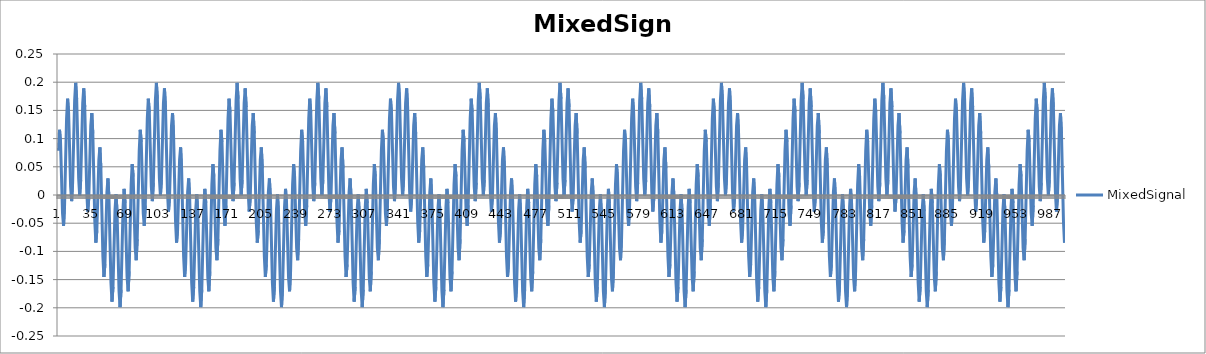
| Category | MixedSignal |
|---|---|
| 0 | 0.079 |
| 1 | 0.116 |
| 2 | 0.094 |
| 3 | 0.031 |
| 4 | -0.032 |
| 5 | -0.055 |
| 6 | -0.018 |
| 7 | 0.059 |
| 8 | 0.136 |
| 9 | 0.171 |
| 10 | 0.147 |
| 11 | 0.081 |
| 12 | 0.015 |
| 13 | -0.011 |
| 14 | 0.022 |
| 15 | 0.095 |
| 16 | 0.168 |
| 17 | 0.199 |
| 18 | 0.17 |
| 19 | 0.1 |
| 20 | 0.029 |
| 21 | -0.001 |
| 22 | 0.027 |
| 23 | 0.095 |
| 24 | 0.163 |
| 25 | 0.189 |
| 26 | 0.156 |
| 27 | 0.081 |
| 28 | 0.005 |
| 29 | -0.029 |
| 30 | -0.006 |
| 31 | 0.059 |
| 32 | 0.123 |
| 33 | 0.145 |
| 34 | 0.109 |
| 35 | 0.031 |
| 36 | -0.047 |
| 37 | -0.084 |
| 38 | -0.063 |
| 39 | 0 |
| 40 | 0.063 |
| 41 | 0.084 |
| 42 | 0.047 |
| 43 | -0.031 |
| 44 | -0.109 |
| 45 | -0.145 |
| 46 | -0.123 |
| 47 | -0.059 |
| 48 | 0.006 |
| 49 | 0.029 |
| 50 | -0.005 |
| 51 | -0.081 |
| 52 | -0.156 |
| 53 | -0.189 |
| 54 | -0.163 |
| 55 | -0.095 |
| 56 | -0.027 |
| 57 | 0.001 |
| 58 | -0.029 |
| 59 | -0.1 |
| 60 | -0.17 |
| 61 | -0.199 |
| 62 | -0.168 |
| 63 | -0.095 |
| 64 | -0.022 |
| 65 | 0.011 |
| 66 | -0.015 |
| 67 | -0.081 |
| 68 | -0.147 |
| 69 | -0.171 |
| 70 | -0.136 |
| 71 | -0.059 |
| 72 | 0.018 |
| 73 | 0.055 |
| 74 | 0.032 |
| 75 | -0.031 |
| 76 | -0.094 |
| 77 | -0.116 |
| 78 | -0.079 |
| 79 | 0 |
| 80 | 0.079 |
| 81 | 0.116 |
| 82 | 0.094 |
| 83 | 0.031 |
| 84 | -0.032 |
| 85 | -0.055 |
| 86 | -0.018 |
| 87 | 0.059 |
| 88 | 0.136 |
| 89 | 0.171 |
| 90 | 0.147 |
| 91 | 0.081 |
| 92 | 0.015 |
| 93 | -0.011 |
| 94 | 0.022 |
| 95 | 0.095 |
| 96 | 0.168 |
| 97 | 0.199 |
| 98 | 0.17 |
| 99 | 0.1 |
| 100 | 0.029 |
| 101 | -0.001 |
| 102 | 0.027 |
| 103 | 0.095 |
| 104 | 0.163 |
| 105 | 0.189 |
| 106 | 0.156 |
| 107 | 0.081 |
| 108 | 0.005 |
| 109 | -0.029 |
| 110 | -0.006 |
| 111 | 0.059 |
| 112 | 0.123 |
| 113 | 0.145 |
| 114 | 0.109 |
| 115 | 0.031 |
| 116 | -0.047 |
| 117 | -0.084 |
| 118 | -0.063 |
| 119 | 0 |
| 120 | 0.063 |
| 121 | 0.084 |
| 122 | 0.047 |
| 123 | -0.031 |
| 124 | -0.109 |
| 125 | -0.145 |
| 126 | -0.123 |
| 127 | -0.059 |
| 128 | 0.006 |
| 129 | 0.029 |
| 130 | -0.005 |
| 131 | -0.081 |
| 132 | -0.156 |
| 133 | -0.189 |
| 134 | -0.163 |
| 135 | -0.095 |
| 136 | -0.027 |
| 137 | 0.001 |
| 138 | -0.029 |
| 139 | -0.1 |
| 140 | -0.17 |
| 141 | -0.199 |
| 142 | -0.168 |
| 143 | -0.095 |
| 144 | -0.022 |
| 145 | 0.011 |
| 146 | -0.015 |
| 147 | -0.081 |
| 148 | -0.147 |
| 149 | -0.171 |
| 150 | -0.136 |
| 151 | -0.059 |
| 152 | 0.018 |
| 153 | 0.055 |
| 154 | 0.032 |
| 155 | -0.031 |
| 156 | -0.094 |
| 157 | -0.116 |
| 158 | -0.079 |
| 159 | 0 |
| 160 | 0.079 |
| 161 | 0.116 |
| 162 | 0.094 |
| 163 | 0.031 |
| 164 | -0.032 |
| 165 | -0.055 |
| 166 | -0.018 |
| 167 | 0.059 |
| 168 | 0.136 |
| 169 | 0.171 |
| 170 | 0.147 |
| 171 | 0.081 |
| 172 | 0.015 |
| 173 | -0.011 |
| 174 | 0.022 |
| 175 | 0.095 |
| 176 | 0.168 |
| 177 | 0.199 |
| 178 | 0.17 |
| 179 | 0.1 |
| 180 | 0.029 |
| 181 | -0.001 |
| 182 | 0.027 |
| 183 | 0.095 |
| 184 | 0.163 |
| 185 | 0.189 |
| 186 | 0.156 |
| 187 | 0.081 |
| 188 | 0.005 |
| 189 | -0.029 |
| 190 | -0.006 |
| 191 | 0.059 |
| 192 | 0.123 |
| 193 | 0.145 |
| 194 | 0.109 |
| 195 | 0.031 |
| 196 | -0.047 |
| 197 | -0.084 |
| 198 | -0.063 |
| 199 | 0 |
| 200 | 0.063 |
| 201 | 0.084 |
| 202 | 0.047 |
| 203 | -0.031 |
| 204 | -0.109 |
| 205 | -0.145 |
| 206 | -0.123 |
| 207 | -0.059 |
| 208 | 0.006 |
| 209 | 0.029 |
| 210 | -0.005 |
| 211 | -0.081 |
| 212 | -0.156 |
| 213 | -0.189 |
| 214 | -0.163 |
| 215 | -0.095 |
| 216 | -0.027 |
| 217 | 0.001 |
| 218 | -0.029 |
| 219 | -0.1 |
| 220 | -0.17 |
| 221 | -0.199 |
| 222 | -0.168 |
| 223 | -0.095 |
| 224 | -0.022 |
| 225 | 0.011 |
| 226 | -0.015 |
| 227 | -0.081 |
| 228 | -0.147 |
| 229 | -0.171 |
| 230 | -0.136 |
| 231 | -0.059 |
| 232 | 0.018 |
| 233 | 0.055 |
| 234 | 0.032 |
| 235 | -0.031 |
| 236 | -0.094 |
| 237 | -0.116 |
| 238 | -0.079 |
| 239 | 0 |
| 240 | 0.079 |
| 241 | 0.116 |
| 242 | 0.094 |
| 243 | 0.031 |
| 244 | -0.032 |
| 245 | -0.055 |
| 246 | -0.018 |
| 247 | 0.059 |
| 248 | 0.136 |
| 249 | 0.171 |
| 250 | 0.147 |
| 251 | 0.081 |
| 252 | 0.015 |
| 253 | -0.011 |
| 254 | 0.022 |
| 255 | 0.095 |
| 256 | 0.168 |
| 257 | 0.199 |
| 258 | 0.17 |
| 259 | 0.1 |
| 260 | 0.029 |
| 261 | -0.001 |
| 262 | 0.027 |
| 263 | 0.095 |
| 264 | 0.163 |
| 265 | 0.189 |
| 266 | 0.156 |
| 267 | 0.081 |
| 268 | 0.005 |
| 269 | -0.029 |
| 270 | -0.006 |
| 271 | 0.059 |
| 272 | 0.123 |
| 273 | 0.145 |
| 274 | 0.109 |
| 275 | 0.031 |
| 276 | -0.047 |
| 277 | -0.084 |
| 278 | -0.063 |
| 279 | 0 |
| 280 | 0.063 |
| 281 | 0.084 |
| 282 | 0.047 |
| 283 | -0.031 |
| 284 | -0.109 |
| 285 | -0.145 |
| 286 | -0.123 |
| 287 | -0.059 |
| 288 | 0.006 |
| 289 | 0.029 |
| 290 | -0.005 |
| 291 | -0.081 |
| 292 | -0.156 |
| 293 | -0.189 |
| 294 | -0.163 |
| 295 | -0.095 |
| 296 | -0.027 |
| 297 | 0.001 |
| 298 | -0.029 |
| 299 | -0.1 |
| 300 | -0.17 |
| 301 | -0.199 |
| 302 | -0.168 |
| 303 | -0.095 |
| 304 | -0.022 |
| 305 | 0.011 |
| 306 | -0.015 |
| 307 | -0.081 |
| 308 | -0.147 |
| 309 | -0.171 |
| 310 | -0.136 |
| 311 | -0.059 |
| 312 | 0.018 |
| 313 | 0.055 |
| 314 | 0.032 |
| 315 | -0.031 |
| 316 | -0.094 |
| 317 | -0.116 |
| 318 | -0.079 |
| 319 | 0 |
| 320 | 0.079 |
| 321 | 0.116 |
| 322 | 0.094 |
| 323 | 0.031 |
| 324 | -0.032 |
| 325 | -0.055 |
| 326 | -0.018 |
| 327 | 0.059 |
| 328 | 0.136 |
| 329 | 0.171 |
| 330 | 0.147 |
| 331 | 0.081 |
| 332 | 0.015 |
| 333 | -0.011 |
| 334 | 0.022 |
| 335 | 0.095 |
| 336 | 0.168 |
| 337 | 0.199 |
| 338 | 0.17 |
| 339 | 0.1 |
| 340 | 0.029 |
| 341 | -0.001 |
| 342 | 0.027 |
| 343 | 0.095 |
| 344 | 0.163 |
| 345 | 0.189 |
| 346 | 0.156 |
| 347 | 0.081 |
| 348 | 0.005 |
| 349 | -0.029 |
| 350 | -0.006 |
| 351 | 0.059 |
| 352 | 0.123 |
| 353 | 0.145 |
| 354 | 0.109 |
| 355 | 0.031 |
| 356 | -0.047 |
| 357 | -0.084 |
| 358 | -0.063 |
| 359 | 0 |
| 360 | 0.063 |
| 361 | 0.084 |
| 362 | 0.047 |
| 363 | -0.031 |
| 364 | -0.109 |
| 365 | -0.145 |
| 366 | -0.123 |
| 367 | -0.059 |
| 368 | 0.006 |
| 369 | 0.029 |
| 370 | -0.005 |
| 371 | -0.081 |
| 372 | -0.156 |
| 373 | -0.189 |
| 374 | -0.163 |
| 375 | -0.095 |
| 376 | -0.027 |
| 377 | 0.001 |
| 378 | -0.029 |
| 379 | -0.1 |
| 380 | -0.17 |
| 381 | -0.199 |
| 382 | -0.168 |
| 383 | -0.095 |
| 384 | -0.022 |
| 385 | 0.011 |
| 386 | -0.015 |
| 387 | -0.081 |
| 388 | -0.147 |
| 389 | -0.171 |
| 390 | -0.136 |
| 391 | -0.059 |
| 392 | 0.018 |
| 393 | 0.055 |
| 394 | 0.032 |
| 395 | -0.031 |
| 396 | -0.094 |
| 397 | -0.116 |
| 398 | -0.079 |
| 399 | 0 |
| 400 | 0.079 |
| 401 | 0.116 |
| 402 | 0.094 |
| 403 | 0.031 |
| 404 | -0.032 |
| 405 | -0.055 |
| 406 | -0.018 |
| 407 | 0.059 |
| 408 | 0.136 |
| 409 | 0.171 |
| 410 | 0.147 |
| 411 | 0.081 |
| 412 | 0.015 |
| 413 | -0.011 |
| 414 | 0.022 |
| 415 | 0.095 |
| 416 | 0.168 |
| 417 | 0.199 |
| 418 | 0.17 |
| 419 | 0.1 |
| 420 | 0.029 |
| 421 | -0.001 |
| 422 | 0.027 |
| 423 | 0.095 |
| 424 | 0.163 |
| 425 | 0.189 |
| 426 | 0.156 |
| 427 | 0.081 |
| 428 | 0.005 |
| 429 | -0.029 |
| 430 | -0.006 |
| 431 | 0.059 |
| 432 | 0.123 |
| 433 | 0.145 |
| 434 | 0.109 |
| 435 | 0.031 |
| 436 | -0.047 |
| 437 | -0.084 |
| 438 | -0.063 |
| 439 | 0 |
| 440 | 0.063 |
| 441 | 0.084 |
| 442 | 0.047 |
| 443 | -0.031 |
| 444 | -0.109 |
| 445 | -0.145 |
| 446 | -0.123 |
| 447 | -0.059 |
| 448 | 0.006 |
| 449 | 0.029 |
| 450 | -0.005 |
| 451 | -0.081 |
| 452 | -0.156 |
| 453 | -0.189 |
| 454 | -0.163 |
| 455 | -0.095 |
| 456 | -0.027 |
| 457 | 0.001 |
| 458 | -0.029 |
| 459 | -0.1 |
| 460 | -0.17 |
| 461 | -0.199 |
| 462 | -0.168 |
| 463 | -0.095 |
| 464 | -0.022 |
| 465 | 0.011 |
| 466 | -0.015 |
| 467 | -0.081 |
| 468 | -0.147 |
| 469 | -0.171 |
| 470 | -0.136 |
| 471 | -0.059 |
| 472 | 0.018 |
| 473 | 0.055 |
| 474 | 0.032 |
| 475 | -0.031 |
| 476 | -0.094 |
| 477 | -0.116 |
| 478 | -0.079 |
| 479 | 0 |
| 480 | 0.079 |
| 481 | 0.116 |
| 482 | 0.094 |
| 483 | 0.031 |
| 484 | -0.032 |
| 485 | -0.055 |
| 486 | -0.018 |
| 487 | 0.059 |
| 488 | 0.136 |
| 489 | 0.171 |
| 490 | 0.147 |
| 491 | 0.081 |
| 492 | 0.015 |
| 493 | -0.011 |
| 494 | 0.022 |
| 495 | 0.095 |
| 496 | 0.168 |
| 497 | 0.199 |
| 498 | 0.17 |
| 499 | 0.1 |
| 500 | 0.029 |
| 501 | -0.001 |
| 502 | 0.027 |
| 503 | 0.095 |
| 504 | 0.163 |
| 505 | 0.189 |
| 506 | 0.156 |
| 507 | 0.081 |
| 508 | 0.005 |
| 509 | -0.029 |
| 510 | -0.006 |
| 511 | 0.059 |
| 512 | 0.123 |
| 513 | 0.145 |
| 514 | 0.109 |
| 515 | 0.031 |
| 516 | -0.047 |
| 517 | -0.084 |
| 518 | -0.063 |
| 519 | 0 |
| 520 | 0.063 |
| 521 | 0.084 |
| 522 | 0.047 |
| 523 | -0.031 |
| 524 | -0.109 |
| 525 | -0.145 |
| 526 | -0.123 |
| 527 | -0.059 |
| 528 | 0.006 |
| 529 | 0.029 |
| 530 | -0.005 |
| 531 | -0.081 |
| 532 | -0.156 |
| 533 | -0.189 |
| 534 | -0.163 |
| 535 | -0.095 |
| 536 | -0.027 |
| 537 | 0.001 |
| 538 | -0.029 |
| 539 | -0.1 |
| 540 | -0.17 |
| 541 | -0.199 |
| 542 | -0.168 |
| 543 | -0.095 |
| 544 | -0.022 |
| 545 | 0.011 |
| 546 | -0.015 |
| 547 | -0.081 |
| 548 | -0.147 |
| 549 | -0.171 |
| 550 | -0.136 |
| 551 | -0.059 |
| 552 | 0.018 |
| 553 | 0.055 |
| 554 | 0.032 |
| 555 | -0.031 |
| 556 | -0.094 |
| 557 | -0.116 |
| 558 | -0.079 |
| 559 | 0 |
| 560 | 0.079 |
| 561 | 0.116 |
| 562 | 0.094 |
| 563 | 0.031 |
| 564 | -0.032 |
| 565 | -0.055 |
| 566 | -0.018 |
| 567 | 0.059 |
| 568 | 0.136 |
| 569 | 0.171 |
| 570 | 0.147 |
| 571 | 0.081 |
| 572 | 0.015 |
| 573 | -0.011 |
| 574 | 0.022 |
| 575 | 0.095 |
| 576 | 0.168 |
| 577 | 0.199 |
| 578 | 0.17 |
| 579 | 0.1 |
| 580 | 0.029 |
| 581 | -0.001 |
| 582 | 0.027 |
| 583 | 0.095 |
| 584 | 0.163 |
| 585 | 0.189 |
| 586 | 0.156 |
| 587 | 0.081 |
| 588 | 0.005 |
| 589 | -0.029 |
| 590 | -0.006 |
| 591 | 0.059 |
| 592 | 0.123 |
| 593 | 0.145 |
| 594 | 0.109 |
| 595 | 0.031 |
| 596 | -0.047 |
| 597 | -0.084 |
| 598 | -0.063 |
| 599 | 0 |
| 600 | 0.063 |
| 601 | 0.084 |
| 602 | 0.047 |
| 603 | -0.031 |
| 604 | -0.109 |
| 605 | -0.145 |
| 606 | -0.123 |
| 607 | -0.059 |
| 608 | 0.006 |
| 609 | 0.029 |
| 610 | -0.005 |
| 611 | -0.081 |
| 612 | -0.156 |
| 613 | -0.189 |
| 614 | -0.163 |
| 615 | -0.095 |
| 616 | -0.027 |
| 617 | 0.001 |
| 618 | -0.029 |
| 619 | -0.1 |
| 620 | -0.17 |
| 621 | -0.199 |
| 622 | -0.168 |
| 623 | -0.095 |
| 624 | -0.022 |
| 625 | 0.011 |
| 626 | -0.015 |
| 627 | -0.081 |
| 628 | -0.147 |
| 629 | -0.171 |
| 630 | -0.136 |
| 631 | -0.059 |
| 632 | 0.018 |
| 633 | 0.055 |
| 634 | 0.032 |
| 635 | -0.031 |
| 636 | -0.094 |
| 637 | -0.116 |
| 638 | -0.079 |
| 639 | 0 |
| 640 | 0.079 |
| 641 | 0.116 |
| 642 | 0.094 |
| 643 | 0.031 |
| 644 | -0.032 |
| 645 | -0.055 |
| 646 | -0.018 |
| 647 | 0.059 |
| 648 | 0.136 |
| 649 | 0.171 |
| 650 | 0.147 |
| 651 | 0.081 |
| 652 | 0.015 |
| 653 | -0.011 |
| 654 | 0.022 |
| 655 | 0.095 |
| 656 | 0.168 |
| 657 | 0.199 |
| 658 | 0.17 |
| 659 | 0.1 |
| 660 | 0.029 |
| 661 | -0.001 |
| 662 | 0.027 |
| 663 | 0.095 |
| 664 | 0.163 |
| 665 | 0.189 |
| 666 | 0.156 |
| 667 | 0.081 |
| 668 | 0.005 |
| 669 | -0.029 |
| 670 | -0.006 |
| 671 | 0.059 |
| 672 | 0.123 |
| 673 | 0.145 |
| 674 | 0.109 |
| 675 | 0.031 |
| 676 | -0.047 |
| 677 | -0.084 |
| 678 | -0.063 |
| 679 | 0 |
| 680 | 0.063 |
| 681 | 0.084 |
| 682 | 0.047 |
| 683 | -0.031 |
| 684 | -0.109 |
| 685 | -0.145 |
| 686 | -0.123 |
| 687 | -0.059 |
| 688 | 0.006 |
| 689 | 0.029 |
| 690 | -0.005 |
| 691 | -0.081 |
| 692 | -0.156 |
| 693 | -0.189 |
| 694 | -0.163 |
| 695 | -0.095 |
| 696 | -0.027 |
| 697 | 0.001 |
| 698 | -0.029 |
| 699 | -0.1 |
| 700 | -0.17 |
| 701 | -0.199 |
| 702 | -0.168 |
| 703 | -0.095 |
| 704 | -0.022 |
| 705 | 0.011 |
| 706 | -0.015 |
| 707 | -0.081 |
| 708 | -0.147 |
| 709 | -0.171 |
| 710 | -0.136 |
| 711 | -0.059 |
| 712 | 0.018 |
| 713 | 0.055 |
| 714 | 0.032 |
| 715 | -0.031 |
| 716 | -0.094 |
| 717 | -0.116 |
| 718 | -0.079 |
| 719 | 0 |
| 720 | 0.079 |
| 721 | 0.116 |
| 722 | 0.094 |
| 723 | 0.031 |
| 724 | -0.032 |
| 725 | -0.055 |
| 726 | -0.018 |
| 727 | 0.059 |
| 728 | 0.136 |
| 729 | 0.171 |
| 730 | 0.147 |
| 731 | 0.081 |
| 732 | 0.015 |
| 733 | -0.011 |
| 734 | 0.022 |
| 735 | 0.095 |
| 736 | 0.168 |
| 737 | 0.199 |
| 738 | 0.17 |
| 739 | 0.1 |
| 740 | 0.029 |
| 741 | -0.001 |
| 742 | 0.027 |
| 743 | 0.095 |
| 744 | 0.163 |
| 745 | 0.189 |
| 746 | 0.156 |
| 747 | 0.081 |
| 748 | 0.005 |
| 749 | -0.029 |
| 750 | -0.006 |
| 751 | 0.059 |
| 752 | 0.123 |
| 753 | 0.145 |
| 754 | 0.109 |
| 755 | 0.031 |
| 756 | -0.047 |
| 757 | -0.084 |
| 758 | -0.063 |
| 759 | 0 |
| 760 | 0.063 |
| 761 | 0.084 |
| 762 | 0.047 |
| 763 | -0.031 |
| 764 | -0.109 |
| 765 | -0.145 |
| 766 | -0.123 |
| 767 | -0.059 |
| 768 | 0.006 |
| 769 | 0.029 |
| 770 | -0.005 |
| 771 | -0.081 |
| 772 | -0.156 |
| 773 | -0.189 |
| 774 | -0.163 |
| 775 | -0.095 |
| 776 | -0.027 |
| 777 | 0.001 |
| 778 | -0.029 |
| 779 | -0.1 |
| 780 | -0.17 |
| 781 | -0.199 |
| 782 | -0.168 |
| 783 | -0.095 |
| 784 | -0.022 |
| 785 | 0.011 |
| 786 | -0.015 |
| 787 | -0.081 |
| 788 | -0.147 |
| 789 | -0.171 |
| 790 | -0.136 |
| 791 | -0.059 |
| 792 | 0.018 |
| 793 | 0.055 |
| 794 | 0.032 |
| 795 | -0.031 |
| 796 | -0.094 |
| 797 | -0.116 |
| 798 | -0.079 |
| 799 | 0 |
| 800 | 0.079 |
| 801 | 0.116 |
| 802 | 0.094 |
| 803 | 0.031 |
| 804 | -0.032 |
| 805 | -0.055 |
| 806 | -0.018 |
| 807 | 0.059 |
| 808 | 0.136 |
| 809 | 0.171 |
| 810 | 0.147 |
| 811 | 0.081 |
| 812 | 0.015 |
| 813 | -0.011 |
| 814 | 0.022 |
| 815 | 0.095 |
| 816 | 0.168 |
| 817 | 0.199 |
| 818 | 0.17 |
| 819 | 0.1 |
| 820 | 0.029 |
| 821 | -0.001 |
| 822 | 0.027 |
| 823 | 0.095 |
| 824 | 0.163 |
| 825 | 0.189 |
| 826 | 0.156 |
| 827 | 0.081 |
| 828 | 0.005 |
| 829 | -0.029 |
| 830 | -0.006 |
| 831 | 0.059 |
| 832 | 0.123 |
| 833 | 0.145 |
| 834 | 0.109 |
| 835 | 0.031 |
| 836 | -0.047 |
| 837 | -0.084 |
| 838 | -0.063 |
| 839 | 0 |
| 840 | 0.063 |
| 841 | 0.084 |
| 842 | 0.047 |
| 843 | -0.031 |
| 844 | -0.109 |
| 845 | -0.145 |
| 846 | -0.123 |
| 847 | -0.059 |
| 848 | 0.006 |
| 849 | 0.029 |
| 850 | -0.005 |
| 851 | -0.081 |
| 852 | -0.156 |
| 853 | -0.189 |
| 854 | -0.163 |
| 855 | -0.095 |
| 856 | -0.027 |
| 857 | 0.001 |
| 858 | -0.029 |
| 859 | -0.1 |
| 860 | -0.17 |
| 861 | -0.199 |
| 862 | -0.168 |
| 863 | -0.095 |
| 864 | -0.022 |
| 865 | 0.011 |
| 866 | -0.015 |
| 867 | -0.081 |
| 868 | -0.147 |
| 869 | -0.171 |
| 870 | -0.136 |
| 871 | -0.059 |
| 872 | 0.018 |
| 873 | 0.055 |
| 874 | 0.032 |
| 875 | -0.031 |
| 876 | -0.094 |
| 877 | -0.116 |
| 878 | -0.079 |
| 879 | 0 |
| 880 | 0.079 |
| 881 | 0.116 |
| 882 | 0.094 |
| 883 | 0.031 |
| 884 | -0.032 |
| 885 | -0.055 |
| 886 | -0.018 |
| 887 | 0.059 |
| 888 | 0.136 |
| 889 | 0.171 |
| 890 | 0.147 |
| 891 | 0.081 |
| 892 | 0.015 |
| 893 | -0.011 |
| 894 | 0.022 |
| 895 | 0.095 |
| 896 | 0.168 |
| 897 | 0.199 |
| 898 | 0.17 |
| 899 | 0.1 |
| 900 | 0.029 |
| 901 | -0.001 |
| 902 | 0.027 |
| 903 | 0.095 |
| 904 | 0.163 |
| 905 | 0.189 |
| 906 | 0.156 |
| 907 | 0.081 |
| 908 | 0.005 |
| 909 | -0.029 |
| 910 | -0.006 |
| 911 | 0.059 |
| 912 | 0.123 |
| 913 | 0.145 |
| 914 | 0.109 |
| 915 | 0.031 |
| 916 | -0.047 |
| 917 | -0.084 |
| 918 | -0.063 |
| 919 | 0 |
| 920 | 0.063 |
| 921 | 0.084 |
| 922 | 0.047 |
| 923 | -0.031 |
| 924 | -0.109 |
| 925 | -0.145 |
| 926 | -0.123 |
| 927 | -0.059 |
| 928 | 0.006 |
| 929 | 0.029 |
| 930 | -0.005 |
| 931 | -0.081 |
| 932 | -0.156 |
| 933 | -0.189 |
| 934 | -0.163 |
| 935 | -0.095 |
| 936 | -0.027 |
| 937 | 0.001 |
| 938 | -0.029 |
| 939 | -0.1 |
| 940 | -0.17 |
| 941 | -0.199 |
| 942 | -0.168 |
| 943 | -0.095 |
| 944 | -0.022 |
| 945 | 0.011 |
| 946 | -0.015 |
| 947 | -0.081 |
| 948 | -0.147 |
| 949 | -0.171 |
| 950 | -0.136 |
| 951 | -0.059 |
| 952 | 0.018 |
| 953 | 0.055 |
| 954 | 0.032 |
| 955 | -0.031 |
| 956 | -0.094 |
| 957 | -0.116 |
| 958 | -0.079 |
| 959 | 0 |
| 960 | 0.079 |
| 961 | 0.116 |
| 962 | 0.094 |
| 963 | 0.031 |
| 964 | -0.032 |
| 965 | -0.055 |
| 966 | -0.018 |
| 967 | 0.059 |
| 968 | 0.136 |
| 969 | 0.171 |
| 970 | 0.147 |
| 971 | 0.081 |
| 972 | 0.015 |
| 973 | -0.011 |
| 974 | 0.022 |
| 975 | 0.095 |
| 976 | 0.168 |
| 977 | 0.199 |
| 978 | 0.17 |
| 979 | 0.1 |
| 980 | 0.029 |
| 981 | -0.001 |
| 982 | 0.027 |
| 983 | 0.095 |
| 984 | 0.163 |
| 985 | 0.189 |
| 986 | 0.156 |
| 987 | 0.081 |
| 988 | 0.005 |
| 989 | -0.029 |
| 990 | -0.006 |
| 991 | 0.059 |
| 992 | 0.123 |
| 993 | 0.145 |
| 994 | 0.109 |
| 995 | 0.031 |
| 996 | -0.047 |
| 997 | -0.084 |
| 998 | -0.063 |